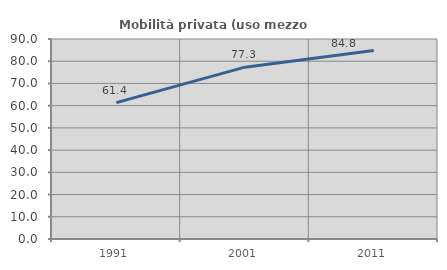
| Category | Mobilità privata (uso mezzo privato) |
|---|---|
| 1991.0 | 61.352 |
| 2001.0 | 77.32 |
| 2011.0 | 84.783 |